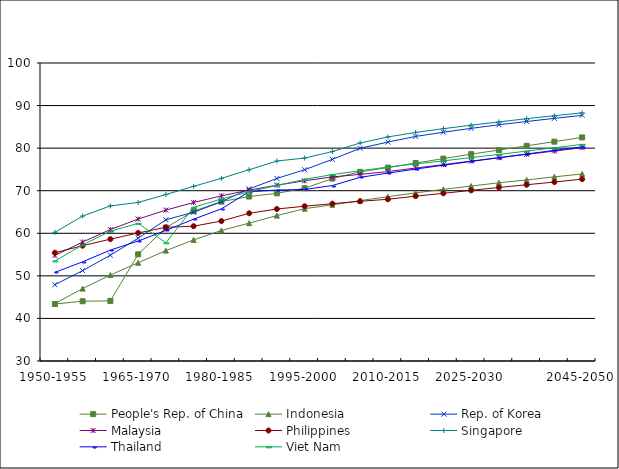
| Category | People's Rep. of China | Indonesia | Rep. of Korea | Malaysia | Philippines | Singapore | Thailand | Viet Nam |
|---|---|---|---|---|---|---|---|---|
| 1950-1955 | 43.389 | 43.491 | 47.924 | 54.792 | 55.43 | 60.228 | 50.811 | 53.505 |
|  | 44.041 | 47.003 | 51.231 | 57.944 | 57.084 | 64.047 | 53.304 | 57.265 |
|  | 44.125 | 50.2 | 54.854 | 60.877 | 58.619 | 66.434 | 56.049 | 60.486 |
| 1965-1970 | 55.051 | 53.086 | 58.838 | 63.342 | 60.078 | 67.241 | 58.184 | 62.333 |
|  | 61.32 | 55.928 | 63.171 | 65.442 | 61.408 | 69.098 | 60.663 | 57.758 |
|  | 65.192 | 58.452 | 64.948 | 67.24 | 61.664 | 71.031 | 63.314 | 66.115 |
| 1980-1985 | 67.446 | 60.659 | 67.397 | 68.791 | 62.874 | 72.895 | 65.74 | 68.057 |
|  | 68.63 | 62.382 | 70.419 | 70.141 | 64.697 | 74.93 | 69.766 | 69.789 |
|  | 69.386 | 64.156 | 72.881 | 71.3 | 65.702 | 76.97 | 70.154 | 71.233 |
| 1995-2000 | 70.587 | 65.777 | 74.932 | 72.333 | 66.355 | 77.671 | 70.289 | 72.654 |
|  | 72.852 | 66.694 | 77.37 | 73.251 | 66.957 | 79.195 | 71.219 | 73.795 |
|  | 74.438 | 67.682 | 79.963 | 73.833 | 67.516 | 81.209 | 73.138 | 74.692 |
| 2010-2015 | 75.432 | 68.591 | 81.425 | 74.497 | 67.988 | 82.635 | 74.137 | 75.563 |
|  | 76.497 | 69.499 | 82.75 | 75.327 | 68.722 | 83.694 | 75.075 | 76.292 |
|  | 77.537 | 70.316 | 83.738 | 76.132 | 69.39 | 84.572 | 75.984 | 77.016 |
| 2025-2030 | 78.597 | 71.096 | 84.644 | 76.958 | 70.086 | 85.398 | 76.874 | 77.783 |
|  | 79.553 | 71.863 | 85.496 | 77.747 | 70.764 | 86.154 | 77.756 | 78.534 |
|  | 80.545 | 72.534 | 86.253 | 78.539 | 71.402 | 86.921 | 78.628 | 79.304 |
|  | 81.527 | 73.252 | 87 | 79.308 | 72.032 | 87.624 | 79.479 | 80.089 |
| 2045-2050 | 82.516 | 73.943 | 87.699 | 80.115 | 72.724 | 88.29 | 80.307 | 80.887 |